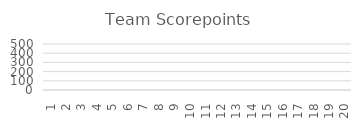
| Category | Score |
|---|---|
| 1.0 | 0 |
| 2.0 | 0 |
| 3.0 | 0 |
| 4.0 | 0 |
| 5.0 | 0 |
| 6.0 | 0 |
| 7.0 | 0 |
| 8.0 | 0 |
| 9.0 | 0 |
| 10.0 | 0 |
| 11.0 | 0 |
| 12.0 | 0 |
| 13.0 | 0 |
| 14.0 | 0 |
| 15.0 | 0 |
| 16.0 | 0 |
| 17.0 | 0 |
| 18.0 | 0 |
| 19.0 | 0 |
| 20.0 | 0 |